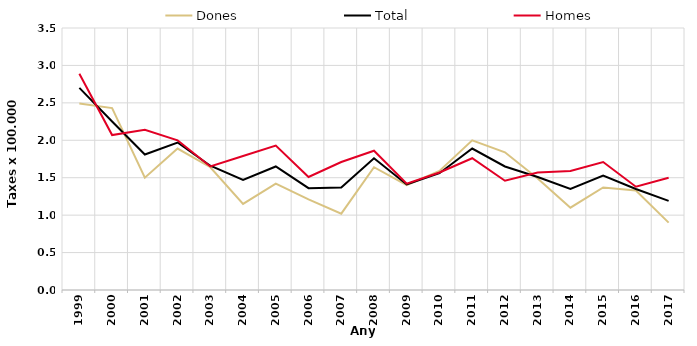
| Category | Dones | Total | Homes |
|---|---|---|---|
| 1999.0 | 2.49 | 2.7 | 2.89 |
| 2000.0 | 2.43 | 2.25 | 2.07 |
| 2001.0 | 1.5 | 1.81 | 2.14 |
| 2002.0 | 1.89 | 1.97 | 2 |
| 2003.0 | 1.64 | 1.66 | 1.65 |
| 2004.0 | 1.15 | 1.47 | 1.79 |
| 2005.0 | 1.42 | 1.65 | 1.93 |
| 2006.0 | 1.21 | 1.36 | 1.51 |
| 2007.0 | 1.02 | 1.37 | 1.71 |
| 2008.0 | 1.64 | 1.76 | 1.86 |
| 2009.0 | 1.4 | 1.41 | 1.42 |
| 2010.0 | 1.59 | 1.56 | 1.57 |
| 2011.0 | 2 | 1.89 | 1.76 |
| 2012.0 | 1.84 | 1.65 | 1.46 |
| 2013.0 | 1.49 | 1.51 | 1.57 |
| 2014.0 | 1.1 | 1.35 | 1.59 |
| 2015.0 | 1.37 | 1.53 | 1.71 |
| 2016.0 | 1.33 | 1.35 | 1.38 |
| 2017.0 | 0.9 | 1.19 | 1.5 |